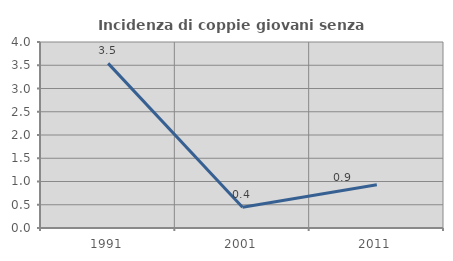
| Category | Incidenza di coppie giovani senza figli |
|---|---|
| 1991.0 | 3.54 |
| 2001.0 | 0.444 |
| 2011.0 | 0.93 |